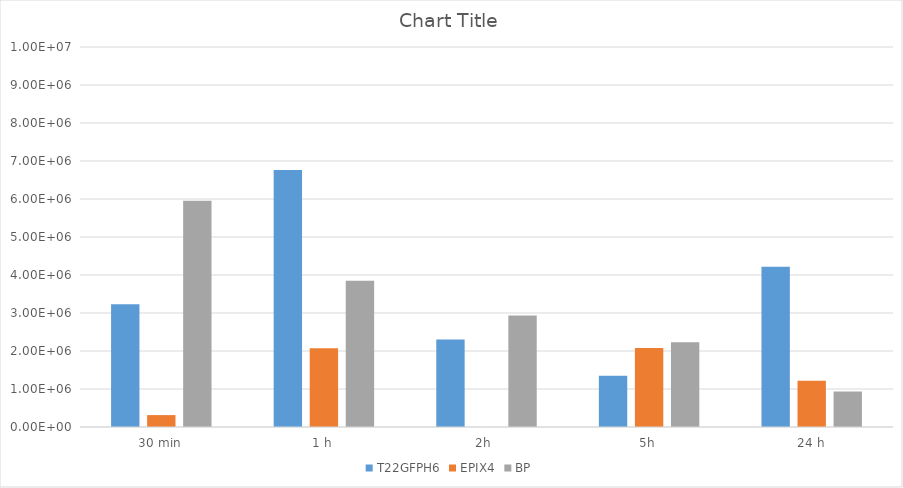
| Category | T22GFPH6 | EPIX4 | BP |
|---|---|---|---|
| 30 min | 3231500 | 313250 | 5952000 |
| 1 h | 6762000 | 2069250 | 3847000 |
| 2h  | 2305000 | 0 | 2932250 |
| 5h | 1351000 | 2078166.667 | 2229666.667 |
| 24 h | 4220000 | 1216833.333 | 931166.667 |